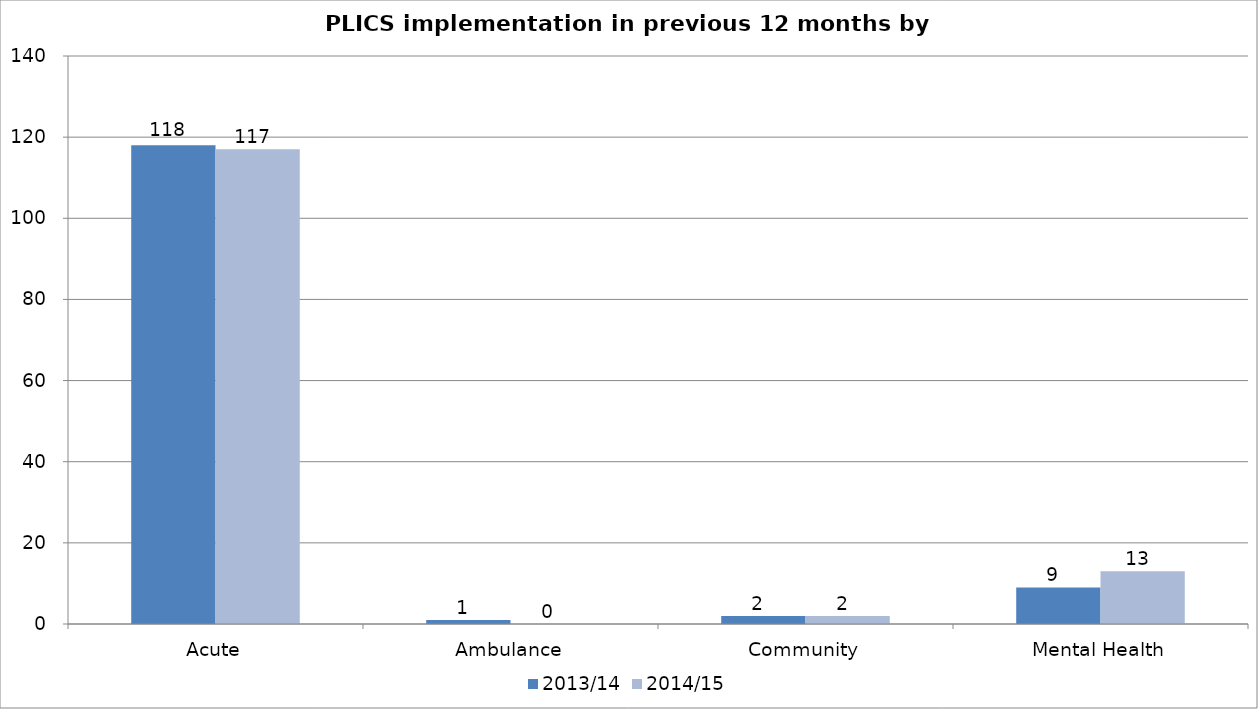
| Category | 2013/14 | 2014/15 |
|---|---|---|
| Acute | 118 | 117 |
| Ambulance | 1 | 0 |
| Community | 2 | 2 |
| Mental Health | 9 | 13 |